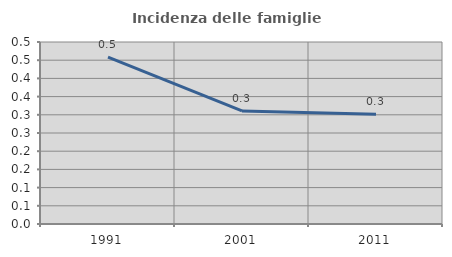
| Category | Incidenza delle famiglie numerose |
|---|---|
| 1991.0 | 0.459 |
| 2001.0 | 0.311 |
| 2011.0 | 0.301 |